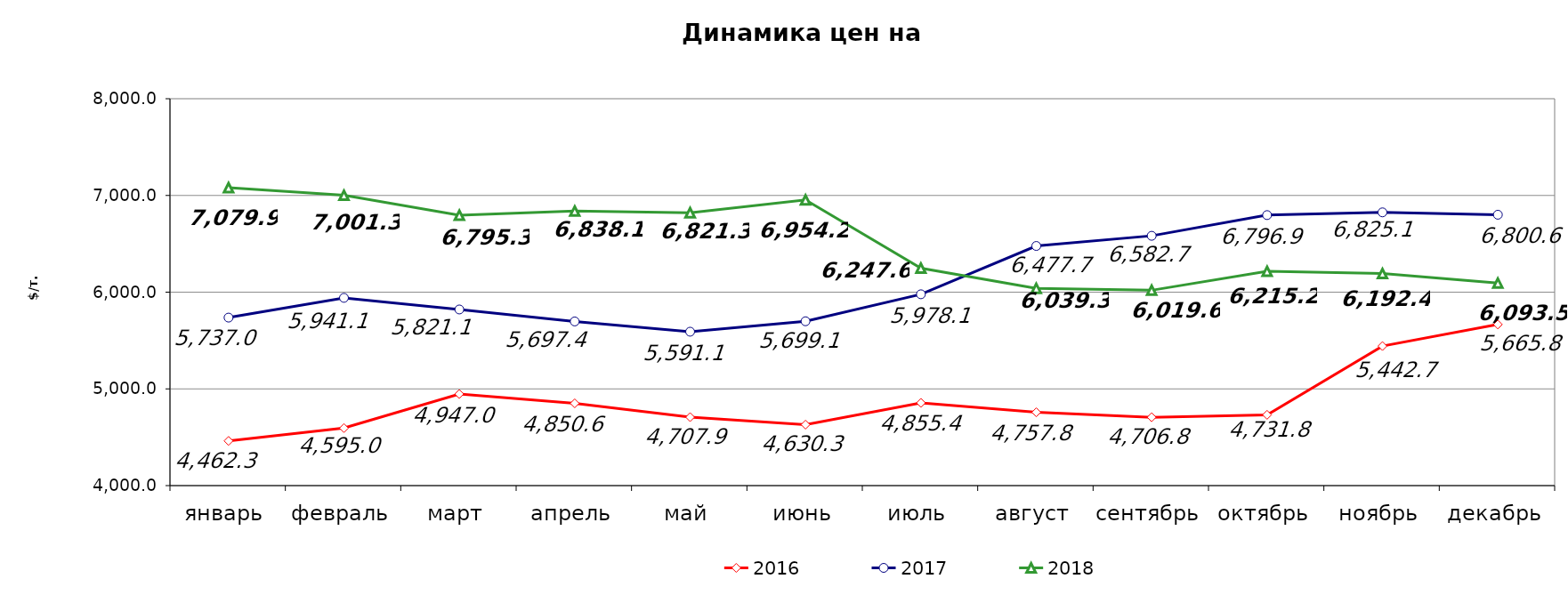
| Category | 2016 | 2017 | 2018 |
|---|---|---|---|
| январь | 4462.3 | 5736.99 | 7079.88 |
| февраль | 4594.96 | 5941.1 | 7001.33 |
| март | 4947.04 | 5821.09 | 6795.25 |
| апрель | 4850.55 | 5697.37 | 6838.07 |
| май | 4707.85 | 5591.11 | 6821.3 |
| июнь | 4630.27 | 5699.08 | 6954.17 |
| июль | 4855.358 | 5978.11 | 6247.62 |
| август | 4757.817 | 6477.68 | 6039.26 |
| сентябрь | 4706.786 | 6582.68 | 6019.61 |
| октябрь | 4731.761 | 6796.85 | 6215.231 |
| ноябрь | 5442.725 | 6825.09 | 6192.385 |
| декабрь | 5665.825 | 6800.64 | 6093.515 |